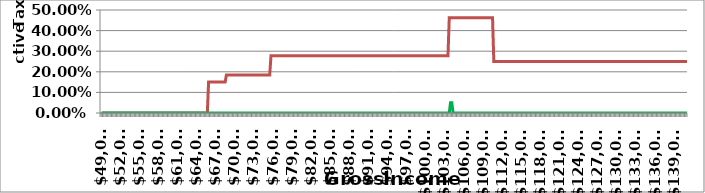
| Category | Married | MyIncome |
|---|---|---|
| 49042.0 | 0 | 0 |
| 49242.0 | 0 | 0 |
| 49442.0 | 0 | 0 |
| 49642.0 | 0 | 0 |
| 49842.0 | 0 | 0 |
| 50042.0 | 0 | 0 |
| 50242.0 | 0 | 0 |
| 50442.0 | 0 | 0 |
| 50642.0 | 0 | 0 |
| 50842.0 | 0 | 0 |
| 51042.0 | 0 | 0 |
| 51242.0 | 0 | 0 |
| 51442.0 | 0 | 0 |
| 51642.0 | 0 | 0 |
| 51842.0 | 0 | 0 |
| 52042.0 | 0 | 0 |
| 52242.0 | 0 | 0 |
| 52442.0 | 0 | 0 |
| 52642.0 | 0 | 0 |
| 52842.0 | 0 | 0 |
| 53042.0 | 0 | 0 |
| 53242.0 | 0 | 0 |
| 53442.0 | 0 | 0 |
| 53642.0 | 0 | 0 |
| 53842.0 | 0 | 0 |
| 54042.0 | 0 | 0 |
| 54242.0 | 0 | 0 |
| 54442.0 | 0 | 0 |
| 54642.0 | 0 | 0 |
| 54842.0 | 0 | 0 |
| 55042.0 | 0 | 0 |
| 55242.0 | 0 | 0 |
| 55442.0 | 0 | 0 |
| 55642.0 | 0 | 0 |
| 55842.0 | 0 | 0 |
| 56042.0 | 0 | 0 |
| 56242.0 | 0 | 0 |
| 56442.0 | 0 | 0 |
| 56642.0 | 0 | 0 |
| 56842.0 | 0 | 0 |
| 57042.0 | 0 | 0 |
| 57242.0 | 0 | 0 |
| 57442.0 | 0 | 0 |
| 57642.0 | 0 | 0 |
| 57842.0 | 0 | 0 |
| 58042.0 | 0 | 0 |
| 58242.0 | 0 | 0 |
| 58442.0 | 0 | 0 |
| 58642.0 | 0 | 0 |
| 58842.0 | 0 | 0 |
| 59042.0 | 0 | 0 |
| 59242.0 | 0 | 0 |
| 59442.0 | 0 | 0 |
| 59642.0 | 0 | 0 |
| 59842.0 | 0 | 0 |
| 60042.0 | 0 | 0 |
| 60242.0 | 0 | 0 |
| 60442.0 | 0 | 0 |
| 60642.0 | 0 | 0 |
| 60842.0 | 0 | 0 |
| 61042.0 | 0 | 0 |
| 61242.0 | 0 | 0 |
| 61442.0 | 0 | 0 |
| 61642.0 | 0 | 0 |
| 61842.0 | 0 | 0 |
| 62042.0 | 0 | 0 |
| 62242.0 | 0 | 0 |
| 62442.0 | 0 | 0 |
| 62642.0 | 0 | 0 |
| 62842.0 | 0 | 0 |
| 63042.0 | 0 | 0 |
| 63242.0 | 0 | 0 |
| 63442.0 | 0 | 0 |
| 63642.0 | 0 | 0 |
| 63842.0 | 0 | 0 |
| 64042.0 | 0 | 0 |
| 64242.0 | 0 | 0 |
| 64442.0 | 0 | 0 |
| 64642.0 | 0 | 0 |
| 64842.0 | 0 | 0 |
| 65042.0 | 0 | 0 |
| 65242.0 | 0 | 0 |
| 65442.0 | 0 | 0 |
| 65642.0 | 0 | 0 |
| 65842.0 | 0.15 | 0 |
| 66042.0 | 0.15 | 0 |
| 66242.0 | 0.15 | 0 |
| 66442.0 | 0.15 | 0 |
| 66642.0 | 0.15 | 0 |
| 66842.0 | 0.15 | 0 |
| 67042.0 | 0.15 | 0 |
| 67242.0 | 0.15 | 0 |
| 67442.0 | 0.15 | 0 |
| 67642.0 | 0.15 | 0 |
| 67842.0 | 0.15 | 0 |
| 68042.0 | 0.15 | 0 |
| 68242.0 | 0.15 | 0 |
| 68442.0 | 0.15 | 0 |
| 68642.0 | 0.185 | 0 |
| 68842.0 | 0.185 | 0 |
| 69042.0 | 0.185 | 0 |
| 69242.0 | 0.185 | 0 |
| 69442.0 | 0.185 | 0 |
| 69642.0 | 0.185 | 0 |
| 69842.0 | 0.185 | 0 |
| 70042.0 | 0.185 | 0 |
| 70242.0 | 0.185 | 0 |
| 70442.0 | 0.185 | 0 |
| 70642.0 | 0.185 | 0 |
| 70842.0 | 0.185 | 0 |
| 71042.0 | 0.185 | 0 |
| 71242.0 | 0.185 | 0 |
| 71442.0 | 0.185 | 0 |
| 71642.0 | 0.185 | 0 |
| 71842.0 | 0.185 | 0 |
| 72042.0 | 0.185 | 0 |
| 72242.0 | 0.185 | 0 |
| 72442.0 | 0.185 | 0 |
| 72642.0 | 0.185 | 0 |
| 72842.0 | 0.185 | 0 |
| 73042.0 | 0.185 | 0 |
| 73242.0 | 0.185 | 0 |
| 73442.0 | 0.185 | 0 |
| 73642.0 | 0.185 | 0 |
| 73842.0 | 0.185 | 0 |
| 74042.0 | 0.185 | 0 |
| 74242.0 | 0.185 | 0 |
| 74442.0 | 0.185 | 0 |
| 74642.0 | 0.185 | 0 |
| 74842.0 | 0.185 | 0 |
| 75042.0 | 0.185 | 0 |
| 75242.0 | 0.185 | 0 |
| 75442.0 | 0.185 | 0 |
| 75642.0 | 0.278 | 0 |
| 75842.0 | 0.278 | 0 |
| 76042.0 | 0.278 | 0 |
| 76242.0 | 0.278 | 0 |
| 76442.0 | 0.278 | 0 |
| 76642.0 | 0.278 | 0 |
| 76842.0 | 0.278 | 0 |
| 77042.0 | 0.278 | 0 |
| 77242.0 | 0.278 | 0 |
| 77442.0 | 0.278 | 0 |
| 77642.0 | 0.278 | 0 |
| 77842.0 | 0.278 | 0 |
| 78042.0 | 0.278 | 0 |
| 78242.0 | 0.278 | 0 |
| 78442.0 | 0.278 | 0 |
| 78642.0 | 0.278 | 0 |
| 78842.0 | 0.278 | 0 |
| 79042.0 | 0.278 | 0 |
| 79242.0 | 0.278 | 0 |
| 79442.0 | 0.278 | 0 |
| 79642.0 | 0.278 | 0 |
| 79842.0 | 0.278 | 0 |
| 80042.0 | 0.278 | 0 |
| 80242.0 | 0.278 | 0 |
| 80442.0 | 0.278 | 0 |
| 80642.0 | 0.278 | 0 |
| 80842.0 | 0.278 | 0 |
| 81042.0 | 0.278 | 0 |
| 81242.0 | 0.278 | 0 |
| 81442.0 | 0.278 | 0 |
| 81642.0 | 0.278 | 0 |
| 81842.0 | 0.278 | 0 |
| 82042.0 | 0.278 | 0 |
| 82242.0 | 0.278 | 0 |
| 82442.0 | 0.278 | 0 |
| 82642.0 | 0.278 | 0 |
| 82842.0 | 0.278 | 0 |
| 83042.0 | 0.278 | 0 |
| 83242.0 | 0.278 | 0 |
| 83442.0 | 0.278 | 0 |
| 83642.0 | 0.278 | 0 |
| 83842.0 | 0.278 | 0 |
| 84042.0 | 0.278 | 0 |
| 84242.0 | 0.278 | 0 |
| 84442.0 | 0.278 | 0 |
| 84642.0 | 0.278 | 0 |
| 84842.0 | 0.278 | 0 |
| 85042.0 | 0.278 | 0 |
| 85242.0 | 0.278 | 0 |
| 85442.0 | 0.278 | 0 |
| 85642.0 | 0.278 | 0 |
| 85842.0 | 0.278 | 0 |
| 86042.0 | 0.278 | 0 |
| 86242.0 | 0.278 | 0 |
| 86442.0 | 0.278 | 0 |
| 86642.0 | 0.278 | 0 |
| 86842.0 | 0.278 | 0 |
| 87042.0 | 0.278 | 0 |
| 87242.0 | 0.278 | 0 |
| 87442.0 | 0.278 | 0 |
| 87642.0 | 0.278 | 0 |
| 87842.0 | 0.278 | 0 |
| 88042.0 | 0.278 | 0 |
| 88242.0 | 0.278 | 0 |
| 88442.0 | 0.278 | 0 |
| 88642.0 | 0.278 | 0 |
| 88842.0 | 0.278 | 0 |
| 89042.0 | 0.278 | 0 |
| 89242.0 | 0.278 | 0 |
| 89442.0 | 0.278 | 0 |
| 89642.0 | 0.278 | 0 |
| 89842.0 | 0.278 | 0 |
| 90042.0 | 0.278 | 0 |
| 90242.0 | 0.278 | 0 |
| 90442.0 | 0.278 | 0 |
| 90642.0 | 0.278 | 0 |
| 90842.0 | 0.278 | 0 |
| 91042.0 | 0.278 | 0 |
| 91242.0 | 0.278 | 0 |
| 91442.0 | 0.278 | 0 |
| 91642.0 | 0.278 | 0 |
| 91842.0 | 0.278 | 0 |
| 92042.0 | 0.278 | 0 |
| 92242.0 | 0.278 | 0 |
| 92442.0 | 0.278 | 0 |
| 92642.0 | 0.278 | 0 |
| 92842.0 | 0.278 | 0 |
| 93042.0 | 0.278 | 0 |
| 93242.0 | 0.278 | 0 |
| 93442.0 | 0.278 | 0 |
| 93642.0 | 0.278 | 0 |
| 93842.0 | 0.278 | 0 |
| 94042.0 | 0.278 | 0 |
| 94242.0 | 0.278 | 0 |
| 94442.0 | 0.278 | 0 |
| 94642.0 | 0.278 | 0 |
| 94842.0 | 0.278 | 0 |
| 95042.0 | 0.278 | 0 |
| 95242.0 | 0.278 | 0 |
| 95442.0 | 0.278 | 0 |
| 95642.0 | 0.278 | 0 |
| 95842.0 | 0.278 | 0 |
| 96042.0 | 0.278 | 0 |
| 96242.0 | 0.278 | 0 |
| 96442.0 | 0.278 | 0 |
| 96642.0 | 0.278 | 0 |
| 96842.0 | 0.278 | 0 |
| 97042.0 | 0.278 | 0 |
| 97242.0 | 0.278 | 0 |
| 97442.0 | 0.278 | 0 |
| 97642.0 | 0.278 | 0 |
| 97842.0 | 0.278 | 0 |
| 98042.0 | 0.278 | 0 |
| 98242.0 | 0.278 | 0 |
| 98442.0 | 0.278 | 0 |
| 98642.0 | 0.278 | 0 |
| 98842.0 | 0.278 | 0 |
| 99042.0 | 0.278 | 0 |
| 99242.0 | 0.278 | 0 |
| 99442.0 | 0.278 | 0 |
| 99642.0 | 0.278 | 0 |
| 99842.0 | 0.278 | 0 |
| 100042.0 | 0.278 | 0 |
| 100242.0 | 0.278 | 0 |
| 100442.0 | 0.278 | 0 |
| 100642.0 | 0.278 | 0 |
| 100842.0 | 0.278 | 0 |
| 101042.0 | 0.278 | 0 |
| 101242.0 | 0.278 | 0 |
| 101442.0 | 0.278 | 0 |
| 101642.0 | 0.278 | 0 |
| 101842.0 | 0.278 | 0 |
| 102042.0 | 0.278 | 0 |
| 102242.0 | 0.278 | 0 |
| 102442.0 | 0.278 | 0 |
| 102642.0 | 0.278 | 0 |
| 102842.0 | 0.278 | 0 |
| 103042.0 | 0.278 | 0 |
| 103242.0 | 0.278 | 0 |
| 103442.0 | 0.278 | 0 |
| 103642.0 | 0.462 | 0 |
| 103842.0 | 0.462 | 0.05 |
| 104042.0 | 0.462 | 0.05 |
| 104242.0 | 0.462 | 0 |
| 104442.0 | 0.462 | 0 |
| 104642.0 | 0.462 | 0 |
| 104842.0 | 0.462 | 0 |
| 105042.0 | 0.462 | 0 |
| 105242.0 | 0.462 | 0 |
| 105442.0 | 0.462 | 0 |
| 105642.0 | 0.462 | 0 |
| 105842.0 | 0.462 | 0 |
| 106042.0 | 0.462 | 0 |
| 106242.0 | 0.462 | 0 |
| 106442.0 | 0.462 | 0 |
| 106642.0 | 0.462 | 0 |
| 106842.0 | 0.462 | 0 |
| 107042.0 | 0.462 | 0 |
| 107242.0 | 0.462 | 0 |
| 107442.0 | 0.462 | 0 |
| 107642.0 | 0.462 | 0 |
| 107842.0 | 0.462 | 0 |
| 108042.0 | 0.462 | 0 |
| 108242.0 | 0.462 | 0 |
| 108442.0 | 0.462 | 0 |
| 108642.0 | 0.462 | 0 |
| 108842.0 | 0.462 | 0 |
| 109042.0 | 0.462 | 0 |
| 109242.0 | 0.462 | 0 |
| 109442.0 | 0.462 | 0 |
| 109642.0 | 0.462 | 0 |
| 109842.0 | 0.462 | 0 |
| 110042.0 | 0.462 | 0 |
| 110242.0 | 0.462 | 0 |
| 110442.0 | 0.462 | 0 |
| 110642.0 | 0.25 | 0 |
| 110842.0 | 0.25 | 0 |
| 111042.0 | 0.25 | 0 |
| 111242.0 | 0.25 | 0 |
| 111442.0 | 0.25 | 0 |
| 111642.0 | 0.25 | 0 |
| 111842.0 | 0.25 | 0 |
| 112042.0 | 0.25 | 0 |
| 112242.0 | 0.25 | 0 |
| 112442.0 | 0.25 | 0 |
| 112642.0 | 0.25 | 0 |
| 112842.0 | 0.25 | 0 |
| 113042.0 | 0.25 | 0 |
| 113242.0 | 0.25 | 0 |
| 113442.0 | 0.25 | 0 |
| 113642.0 | 0.25 | 0 |
| 113842.0 | 0.25 | 0 |
| 114042.0 | 0.25 | 0 |
| 114242.0 | 0.25 | 0 |
| 114442.0 | 0.25 | 0 |
| 114642.0 | 0.25 | 0 |
| 114842.0 | 0.25 | 0 |
| 115042.0 | 0.25 | 0 |
| 115242.0 | 0.25 | 0 |
| 115442.0 | 0.25 | 0 |
| 115642.0 | 0.25 | 0 |
| 115842.0 | 0.25 | 0 |
| 116042.0 | 0.25 | 0 |
| 116242.0 | 0.25 | 0 |
| 116442.0 | 0.25 | 0 |
| 116642.0 | 0.25 | 0 |
| 116842.0 | 0.25 | 0 |
| 117042.0 | 0.25 | 0 |
| 117242.0 | 0.25 | 0 |
| 117442.0 | 0.25 | 0 |
| 117642.0 | 0.25 | 0 |
| 117842.0 | 0.25 | 0 |
| 118042.0 | 0.25 | 0 |
| 118242.0 | 0.25 | 0 |
| 118442.0 | 0.25 | 0 |
| 118642.0 | 0.25 | 0 |
| 118842.0 | 0.25 | 0 |
| 119042.0 | 0.25 | 0 |
| 119242.0 | 0.25 | 0 |
| 119442.0 | 0.25 | 0 |
| 119642.0 | 0.25 | 0 |
| 119842.0 | 0.25 | 0 |
| 120042.0 | 0.25 | 0 |
| 120242.0 | 0.25 | 0 |
| 120442.0 | 0.25 | 0 |
| 120642.0 | 0.25 | 0 |
| 120842.0 | 0.25 | 0 |
| 121042.0 | 0.25 | 0 |
| 121242.0 | 0.25 | 0 |
| 121442.0 | 0.25 | 0 |
| 121642.0 | 0.25 | 0 |
| 121842.0 | 0.25 | 0 |
| 122042.0 | 0.25 | 0 |
| 122242.0 | 0.25 | 0 |
| 122442.0 | 0.25 | 0 |
| 122642.0 | 0.25 | 0 |
| 122842.0 | 0.25 | 0 |
| 123042.0 | 0.25 | 0 |
| 123242.0 | 0.25 | 0 |
| 123442.0 | 0.25 | 0 |
| 123642.0 | 0.25 | 0 |
| 123842.0 | 0.25 | 0 |
| 124042.0 | 0.25 | 0 |
| 124242.0 | 0.25 | 0 |
| 124442.0 | 0.25 | 0 |
| 124642.0 | 0.25 | 0 |
| 124842.0 | 0.25 | 0 |
| 125042.0 | 0.25 | 0 |
| 125242.0 | 0.25 | 0 |
| 125442.0 | 0.25 | 0 |
| 125642.0 | 0.25 | 0 |
| 125842.0 | 0.25 | 0 |
| 126042.0 | 0.25 | 0 |
| 126242.0 | 0.25 | 0 |
| 126442.0 | 0.25 | 0 |
| 126642.0 | 0.25 | 0 |
| 126842.0 | 0.25 | 0 |
| 127042.0 | 0.25 | 0 |
| 127242.0 | 0.25 | 0 |
| 127442.0 | 0.25 | 0 |
| 127642.0 | 0.25 | 0 |
| 127842.0 | 0.25 | 0 |
| 128042.0 | 0.25 | 0 |
| 128242.0 | 0.25 | 0 |
| 128442.0 | 0.25 | 0 |
| 128642.0 | 0.25 | 0 |
| 128842.0 | 0.25 | 0 |
| 129042.0 | 0.25 | 0 |
| 129242.0 | 0.25 | 0 |
| 129442.0 | 0.25 | 0 |
| 129642.0 | 0.25 | 0 |
| 129842.0 | 0.25 | 0 |
| 130042.0 | 0.25 | 0 |
| 130242.0 | 0.25 | 0 |
| 130442.0 | 0.25 | 0 |
| 130642.0 | 0.25 | 0 |
| 130842.0 | 0.25 | 0 |
| 131042.0 | 0.25 | 0 |
| 131242.0 | 0.25 | 0 |
| 131442.0 | 0.25 | 0 |
| 131642.0 | 0.25 | 0 |
| 131842.0 | 0.25 | 0 |
| 132042.0 | 0.25 | 0 |
| 132242.0 | 0.25 | 0 |
| 132442.0 | 0.25 | 0 |
| 132642.0 | 0.25 | 0 |
| 132842.0 | 0.25 | 0 |
| 133042.0 | 0.25 | 0 |
| 133242.0 | 0.25 | 0 |
| 133442.0 | 0.25 | 0 |
| 133642.0 | 0.25 | 0 |
| 133842.0 | 0.25 | 0 |
| 134042.0 | 0.25 | 0 |
| 134242.0 | 0.25 | 0 |
| 134442.0 | 0.25 | 0 |
| 134642.0 | 0.25 | 0 |
| 134842.0 | 0.25 | 0 |
| 135042.0 | 0.25 | 0 |
| 135242.0 | 0.25 | 0 |
| 135442.0 | 0.25 | 0 |
| 135642.0 | 0.25 | 0 |
| 135842.0 | 0.25 | 0 |
| 136042.0 | 0.25 | 0 |
| 136242.0 | 0.25 | 0 |
| 136442.0 | 0.25 | 0 |
| 136642.0 | 0.25 | 0 |
| 136842.0 | 0.25 | 0 |
| 137042.0 | 0.25 | 0 |
| 137242.0 | 0.25 | 0 |
| 137442.0 | 0.25 | 0 |
| 137642.0 | 0.25 | 0 |
| 137842.0 | 0.25 | 0 |
| 138042.0 | 0.25 | 0 |
| 138242.0 | 0.25 | 0 |
| 138442.0 | 0.25 | 0 |
| 138642.0 | 0.25 | 0 |
| 138842.0 | 0.25 | 0 |
| 139042.0 | 0.25 | 0 |
| 139242.0 | 0.25 | 0 |
| 139442.0 | 0.25 | 0 |
| 139642.0 | 0.25 | 0 |
| 139842.0 | 0.25 | 0 |
| 140042.0 | 0.25 | 0 |
| 140242.0 | 0.25 | 0 |
| 140442.0 | 0.25 | 0 |
| 140642.0 | 0.25 | 0 |
| 140842.0 | 0.25 | 0 |
| 141042.0 | 0.25 | 0 |